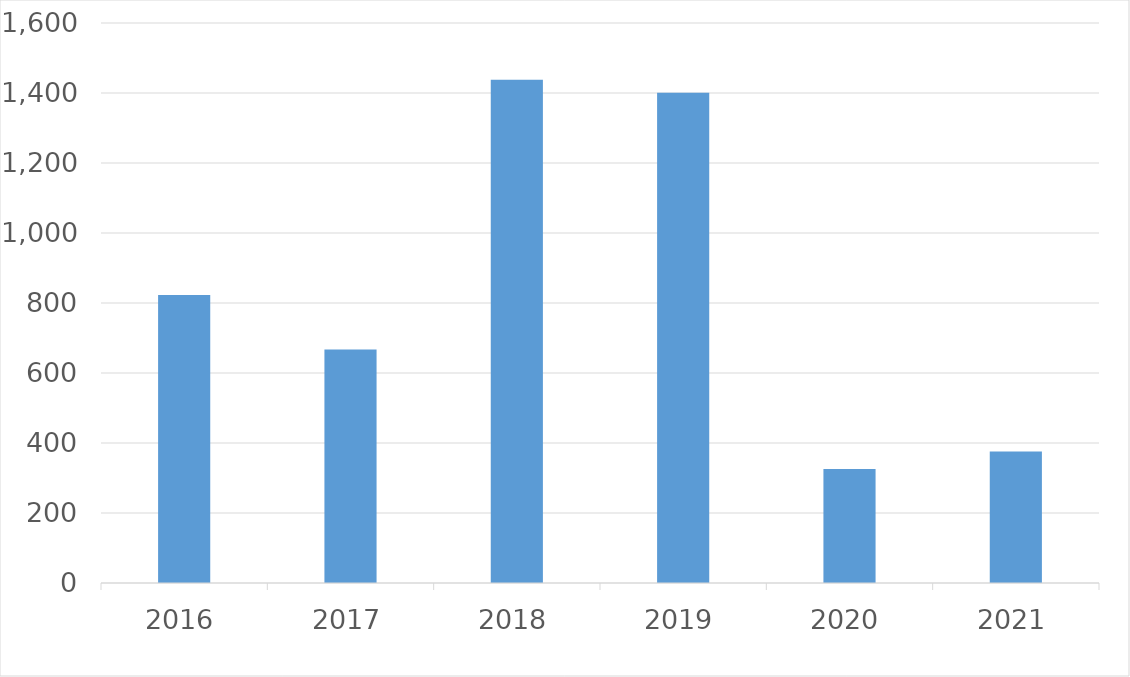
| Category | Series 0 |
|---|---|
| 2016 | 823 |
| 2017 | 667 |
| 2018 | 1438 |
| 2019 | 1401 |
| 2020 | 326 |
| 2021 | 376 |